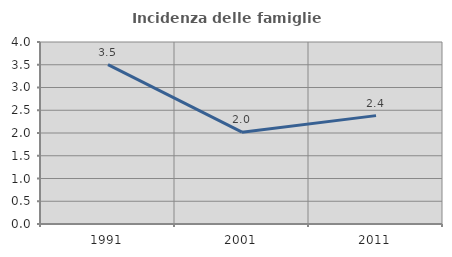
| Category | Incidenza delle famiglie numerose |
|---|---|
| 1991.0 | 3.502 |
| 2001.0 | 2.019 |
| 2011.0 | 2.382 |